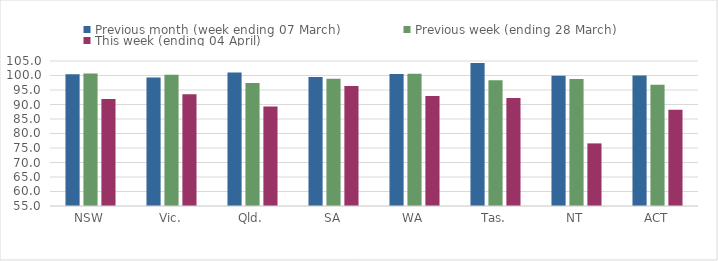
| Category | Previous month (week ending 07 March) | Previous week (ending 28 March) | This week (ending 04 April) |
|---|---|---|---|
| NSW | 100.46 | 100.731 | 91.923 |
| Vic. | 99.344 | 100.29 | 93.536 |
| Qld. | 101.025 | 97.449 | 89.296 |
| SA | 99.515 | 98.897 | 96.34 |
| WA | 100.545 | 100.591 | 92.888 |
| Tas. | 104.323 | 98.372 | 92.252 |
| NT | 99.909 | 98.818 | 76.591 |
| ACT | 100 | 96.85 | 88.189 |